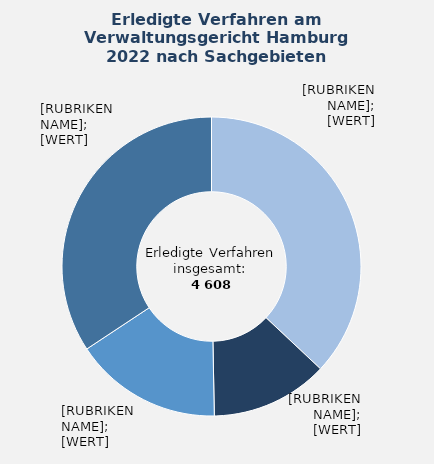
| Category | in Prozent |
|---|---|
| Asylrecht – Hauptsacheverfahren (Asylrecht, Verteilung von Asylbewerbenden) | 37 |
| Ausländerrecht | 12.7 |
| Recht des öffentlichen Dienstes | 16 |
| Übrige Sachgebiete¹ | 34.3 |